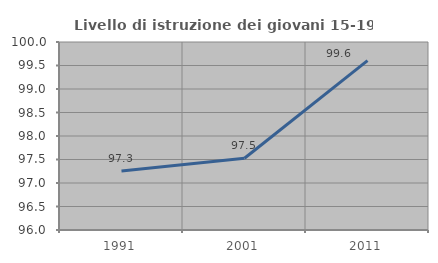
| Category | Livello di istruzione dei giovani 15-19 anni |
|---|---|
| 1991.0 | 97.256 |
| 2001.0 | 97.527 |
| 2011.0 | 99.605 |